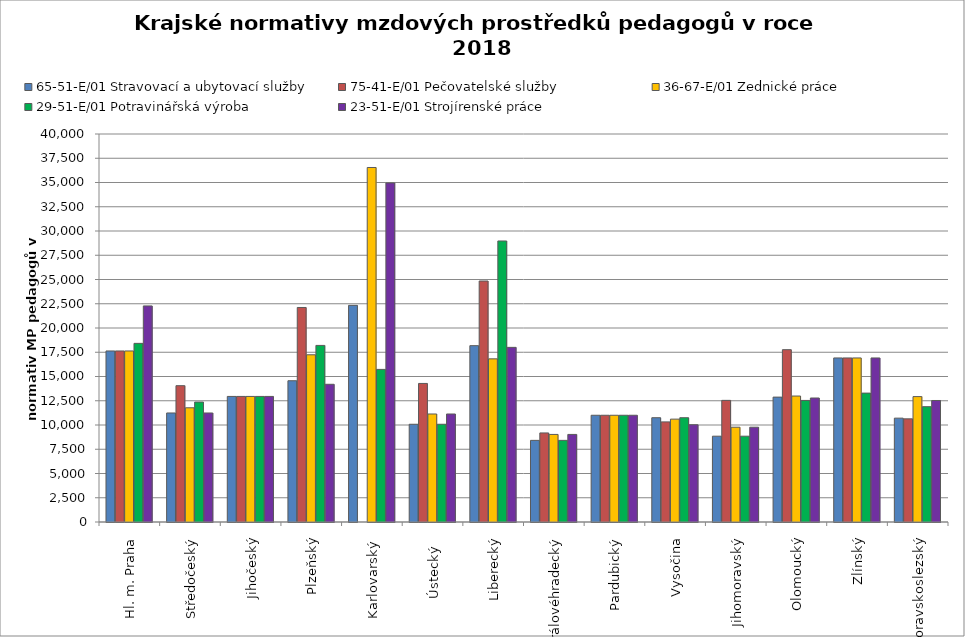
| Category | 65-51-E/01 Stravovací a ubytovací služby | 75-41-E/01 Pečovatelské služby | 36-67-E/01 Zednické práce | 29-51-E/01 Potravinářská výroba | 23-51-E/01 Strojírenské práce |
|---|---|---|---|---|---|
| Hl. m. Praha | 17632.34 | 17632.34 | 17632.34 | 18416 | 22277.419 |
| Středočeský | 11239.294 | 14053.92 | 11774.498 | 12363.223 | 11239.294 |
| Jihočeský | 12945.194 | 12945.194 | 12945.194 | 12945.194 | 12945.194 |
| Plzeňský | 14562.174 | 22116.399 | 17238.596 | 18204.323 | 14196.491 |
| Karlovarský  | 22335.507 | 0 | 36547.042 | 15732.777 | 34953.618 |
| Ústecký   | 10076.796 | 14283.724 | 11135.32 | 10076.796 | 11135.32 |
| Liberecký | 18179.211 | 24844.891 | 16819.664 | 28971.529 | 18003.601 |
| Královéhradecký | 8416.097 | 9182.072 | 9027.248 | 8416.097 | 9027.248 |
| Pardubický | 11003.654 | 11003.654 | 11003.654 | 11003.654 | 11003.654 |
| Vysočina | 10751.357 | 10321.226 | 10605.067 | 10751.357 | 10028.847 |
| Jihomoravský | 8845.273 | 12539.085 | 9772.867 | 8845.273 | 9772.867 |
| Olomoucký | 12874.433 | 17764.975 | 12985.9 | 12532.498 | 12784.292 |
| Zlínský | 16912.909 | 16912.909 | 16912.909 | 13288.714 | 16912.909 |
| Moravskoslezský | 10706.191 | 10633.663 | 12927.463 | 11888.144 | 12526.703 |